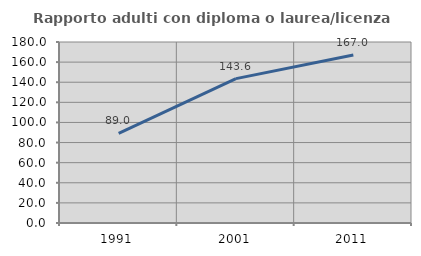
| Category | Rapporto adulti con diploma o laurea/licenza media  |
|---|---|
| 1991.0 | 89.024 |
| 2001.0 | 143.605 |
| 2011.0 | 167.027 |